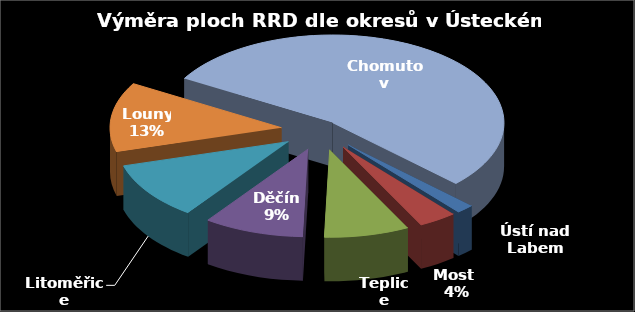
| Category | Výměra [ha] |
|---|---|
| Ústí nad Labem | 3.48 |
| Most  | 7.53 |
| Teplice | 16.77 |
| Děčín | 19.79 |
| Litoměřice | 22.2 |
| Louny | 26.91 |
| Chomutov | 112.69 |